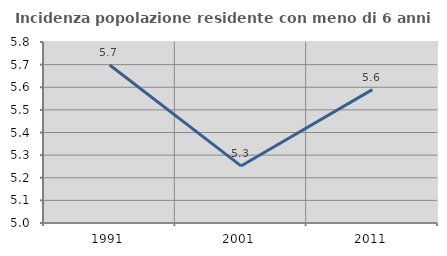
| Category | Incidenza popolazione residente con meno di 6 anni |
|---|---|
| 1991.0 | 5.698 |
| 2001.0 | 5.252 |
| 2011.0 | 5.589 |